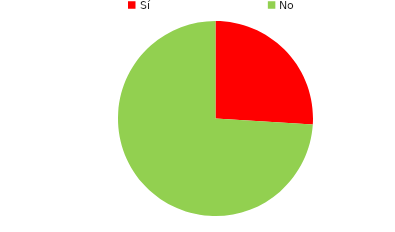
| Category | Series 0 |
|---|---|
| Sí | 26 |
| No | 74 |